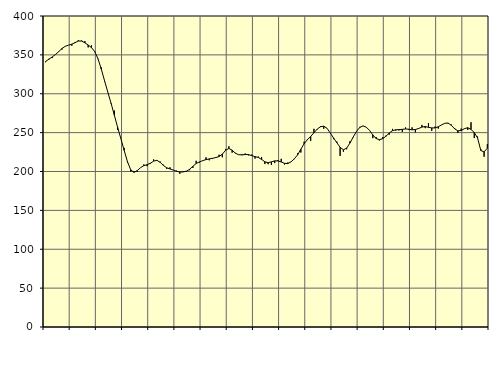
| Category | Piggar | Series 1 |
|---|---|---|
| nan | 340.5 | 341.62 |
| 87.0 | 345 | 344.39 |
| 87.0 | 345.9 | 347.31 |
| 87.0 | 350.1 | 350.44 |
| nan | 354.6 | 354.2 |
| 88.0 | 356.8 | 358.2 |
| 88.0 | 361.2 | 361.06 |
| 88.0 | 362.5 | 362.45 |
| nan | 361.7 | 363.76 |
| 89.0 | 366.6 | 365.71 |
| 89.0 | 369 | 367.84 |
| 89.0 | 368.4 | 367.76 |
| nan | 367.8 | 365.49 |
| 90.0 | 359.6 | 362.69 |
| 90.0 | 362.2 | 359.42 |
| 90.0 | 353.6 | 354.29 |
| nan | 344.6 | 344.99 |
| 91.0 | 333.9 | 331.82 |
| 91.0 | 315.9 | 316.8 |
| 91.0 | 302 | 302.06 |
| nan | 287.1 | 287.8 |
| 92.0 | 278.4 | 272.42 |
| 92.0 | 253.4 | 256.8 |
| 92.0 | 242.3 | 242.15 |
| nan | 230.3 | 227.24 |
| 93.0 | 211.6 | 212.72 |
| 93.0 | 199.9 | 202.23 |
| 93.0 | 200.5 | 198.9 |
| nan | 199.5 | 201.17 |
| 94.0 | 204.9 | 204.91 |
| 94.0 | 209.1 | 207.5 |
| 94.0 | 206.9 | 208.75 |
| nan | 209.7 | 210.52 |
| 95.0 | 215.6 | 213.35 |
| 95.0 | 213.9 | 214.36 |
| 95.0 | 212.8 | 211.77 |
| nan | 208.7 | 207.76 |
| 96.0 | 203.4 | 204.81 |
| 96.0 | 205.4 | 203.28 |
| 96.0 | 201.9 | 201.88 |
| nan | 201.1 | 200.27 |
| 97.0 | 197 | 199.36 |
| 97.0 | 200.2 | 199.47 |
| 97.0 | 199.7 | 200.42 |
| nan | 201.6 | 202.84 |
| 98.0 | 204.6 | 206.69 |
| 98.0 | 213.8 | 210.25 |
| 98.0 | 211.5 | 212.31 |
| nan | 213.8 | 213.93 |
| 99.0 | 218.2 | 215.31 |
| 99.0 | 214.4 | 216.21 |
| 99.0 | 216.2 | 216.95 |
| nan | 218.5 | 217.96 |
| 0.0 | 221.6 | 219.2 |
| 0.0 | 218.3 | 222.28 |
| 0.0 | 228.7 | 227.31 |
| nan | 232.4 | 229.66 |
| 1.0 | 224.2 | 227.46 |
| 1.0 | 224 | 223.45 |
| 1.0 | 221.7 | 221.55 |
| nan | 220.9 | 221.48 |
| 2.0 | 223.2 | 221.84 |
| 2.0 | 220.7 | 221.76 |
| 2.0 | 221.8 | 220.38 |
| nan | 216.6 | 219.11 |
| 3.0 | 219.2 | 218.03 |
| 3.0 | 218.5 | 215.52 |
| 3.0 | 209.6 | 212.54 |
| nan | 209.4 | 211.38 |
| 4.0 | 208.4 | 212.39 |
| 4.0 | 210.8 | 213.7 |
| 4.0 | 214.8 | 213.6 |
| nan | 216.3 | 212.25 |
| 5.0 | 209 | 210.53 |
| 5.0 | 211.6 | 210.17 |
| 5.0 | 212.3 | 212.43 |
| nan | 215.9 | 216.26 |
| 6.0 | 223.3 | 221.37 |
| 6.0 | 224.4 | 228.65 |
| 6.0 | 238.3 | 235.74 |
| nan | 241.6 | 240.87 |
| 7.0 | 239.4 | 245.1 |
| 7.0 | 254.9 | 249.78 |
| 7.0 | 254.1 | 254.55 |
| nan | 258.3 | 257.56 |
| 8.0 | 255 | 258.27 |
| 8.0 | 255.5 | 255.6 |
| 8.0 | 249.4 | 249.44 |
| nan | 241.6 | 243.08 |
| 9.0 | 238.5 | 236.98 |
| 9.0 | 220.1 | 231.16 |
| 9.0 | 225.5 | 227.95 |
| nan | 228.6 | 230.08 |
| 10.0 | 238.9 | 236.52 |
| 10.0 | 244 | 244.32 |
| 10.0 | 251.8 | 251.51 |
| nan | 257.4 | 256.69 |
| 11.0 | 258.4 | 258.67 |
| 11.0 | 256.8 | 257.03 |
| 11.0 | 252.5 | 252.78 |
| nan | 242.9 | 247.08 |
| 12.0 | 244.4 | 242.38 |
| 12.0 | 239.9 | 240.97 |
| 12.0 | 244.2 | 242.19 |
| nan | 246.2 | 245.33 |
| 13.0 | 247.3 | 249.43 |
| 13.0 | 254.8 | 252.56 |
| 13.0 | 252.6 | 253.65 |
| nan | 252.9 | 253.85 |
| 14.0 | 251 | 254.22 |
| 14.0 | 256.7 | 254.69 |
| 14.0 | 253.5 | 254.4 |
| nan | 256.8 | 253.61 |
| 15.0 | 250.4 | 253.98 |
| 15.0 | 254.7 | 255.31 |
| 15.0 | 259.9 | 257.14 |
| nan | 255.8 | 257.82 |
| 16.0 | 262.2 | 256.82 |
| 16.0 | 252.3 | 256.06 |
| 16.0 | 257.7 | 256.06 |
| nan | 255.2 | 257.53 |
| 17.0 | 260 | 259.93 |
| 17.0 | 262 | 262 |
| 17.0 | 261.7 | 262.33 |
| nan | 260.4 | 259.38 |
| 18.0 | 255.9 | 254.86 |
| 18.0 | 249.6 | 252.3 |
| 18.0 | 255.2 | 252.7 |
| nan | 255.3 | 255.09 |
| 19.0 | 253.4 | 256.35 |
| 19.0 | 263.3 | 254.12 |
| 19.0 | 243 | 250.1 |
| nan | 245 | 243.18 |
| 20.0 | 228.6 | 227.01 |
| 20.0 | 219 | 225.2 |
| 20.0 | 235.2 | 230.03 |